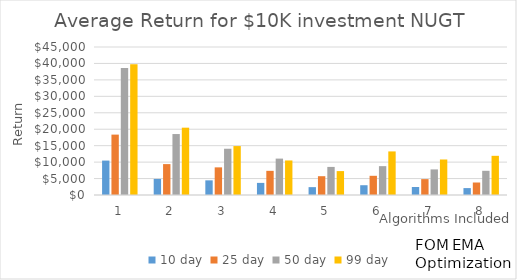
| Category | 10 day | 25 day | 50 day | 99 day |
|---|---|---|---|---|
| 1.0 | 10465.499 | 18362.342 | 38616.557 | 39728.074 |
| 2.0 | 4887.372 | 9393.997 | 18533.989 | 20470.511 |
| 3.0 | 4455.551 | 8403.402 | 14067.001 | 14878.343 |
| 4.0 | 3683.029 | 7346.004 | 11066.908 | 10502.71 |
| 5.0 | 2389.817 | 5715.631 | 8537.455 | 7268.964 |
| 6.0 | 2974.763 | 5836.609 | 8772.704 | 13251.879 |
| 7.0 | 2428.079 | 4827.248 | 7778.102 | 10797.64 |
| 8.0 | 2099.878 | 3798.546 | 7357.323 | 11912.189 |